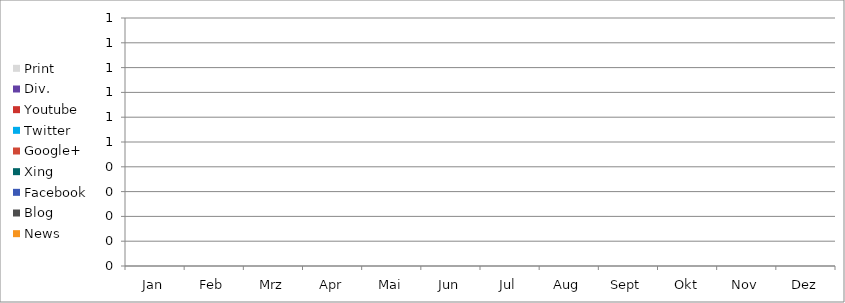
| Category | News | Blog | Facebook | Xing | Google+ | Twitter | Youtube | Div. | Print |
|---|---|---|---|---|---|---|---|---|---|
| Jan | 0 | 0 | 0 | 0 | 0 | 0 | 0 | 0 | 0 |
| Feb | 0 | 0 | 0 | 0 | 0 | 0 | 0 | 0 | 0 |
| Mrz | 0 | 0 | 0 | 0 | 0 | 0 | 0 | 0 | 0 |
| Apr | 0 | 0 | 0 | 0 | 0 | 0 | 0 | 0 | 0 |
| Mai | 0 | 0 | 0 | 0 | 0 | 0 | 0 | 0 | 0 |
| Jun | 0 | 0 | 0 | 0 | 0 | 0 | 0 | 0 | 0 |
| Jul | 0 | 0 | 0 | 0 | 0 | 0 | 0 | 0 | 0 |
| Aug | 0 | 0 | 0 | 0 | 0 | 0 | 0 | 0 | 0 |
| Sept | 0 | 0 | 0 | 0 | 0 | 0 | 0 | 0 | 0 |
| Okt | 0 | 0 | 0 | 0 | 0 | 0 | 0 | 0 | 0 |
| Nov | 0 | 0 | 0 | 0 | 0 | 0 | 0 | 0 | 0 |
| Dez | 0 | 0 | 0 | 0 | 0 | 0 | 0 | 0 | 0 |